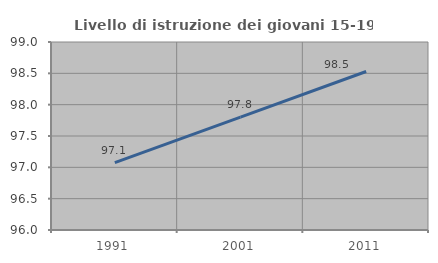
| Category | Livello di istruzione dei giovani 15-19 anni |
|---|---|
| 1991.0 | 97.074 |
| 2001.0 | 97.802 |
| 2011.0 | 98.529 |